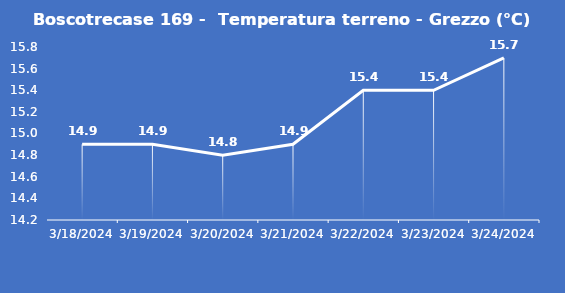
| Category | Boscotrecase 169 -  Temperatura terreno - Grezzo (°C) |
|---|---|
| 3/18/24 | 14.9 |
| 3/19/24 | 14.9 |
| 3/20/24 | 14.8 |
| 3/21/24 | 14.9 |
| 3/22/24 | 15.4 |
| 3/23/24 | 15.4 |
| 3/24/24 | 15.7 |